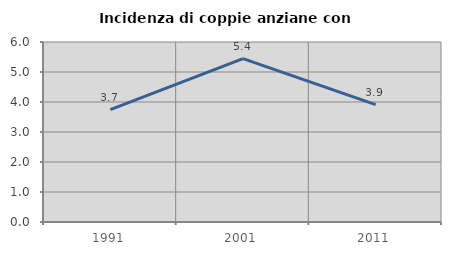
| Category | Incidenza di coppie anziane con figli |
|---|---|
| 1991.0 | 3.745 |
| 2001.0 | 5.447 |
| 2011.0 | 3.914 |